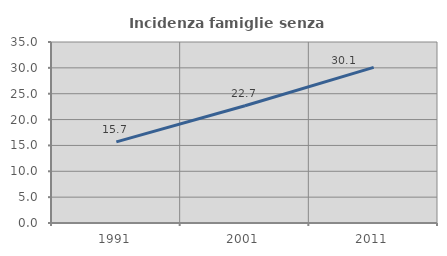
| Category | Incidenza famiglie senza nuclei |
|---|---|
| 1991.0 | 15.696 |
| 2001.0 | 22.681 |
| 2011.0 | 30.097 |